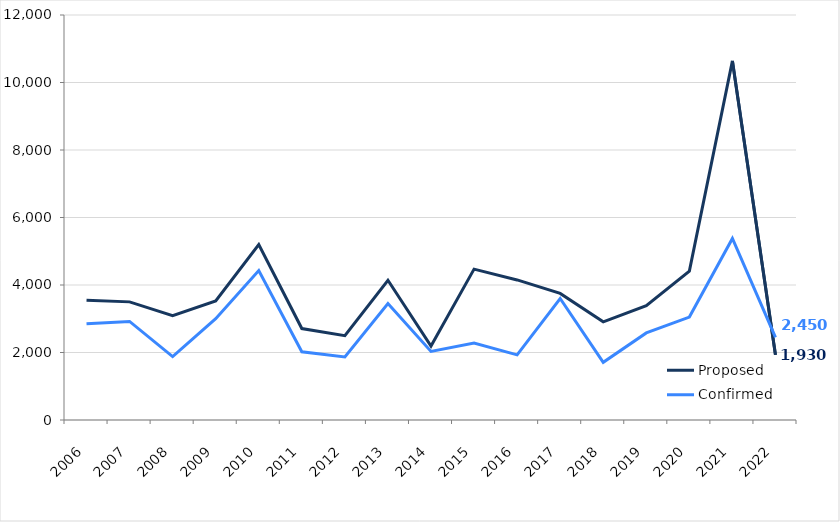
| Category | Proposed | Confirmed |
|---|---|---|
| 2006 | 3550 | 2850 |
| 2007 | 3500 | 2920 |
| 2008 | 3090 | 1880 |
| 2009 | 3530 | 3000 |
| 2010 | 5200 | 4430 |
| 2011 | 2710 | 2020 |
| 2012 | 2500 | 1870 |
| 2013 | 4140 | 3450 |
| 2014 | 2190 | 2030 |
| 2015 | 4470 | 2280 |
| 2016 | 4150 | 1930 |
| 2017 | 3750 | 3600 |
| 2018 | 2910 | 1710 |
| 2019 | 3390 | 2580 |
| 2020 | 4410 | 3050 |
| 2021 | 10640 | 5380 |
| 2022 | 1930 | 2450 |